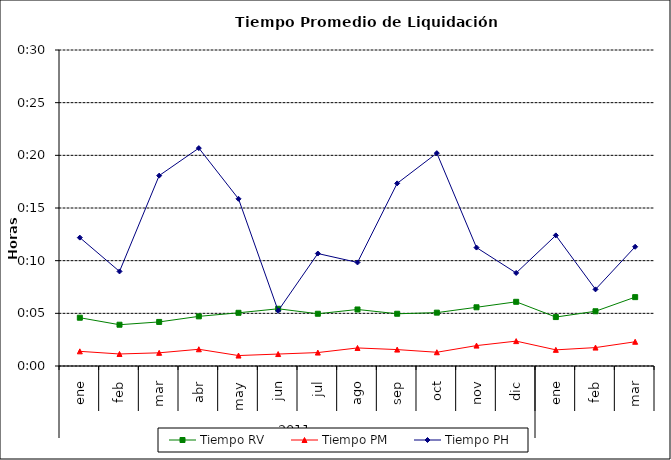
| Category | Tiempo RV | Tiempo PM | Tiempo PH |
|---|---|---|---|
| 0 | 0.003 | 0.001 | 0.009 |
| 1 | 0.003 | 0.001 | 0.006 |
| 2 | 0.003 | 0.001 | 0.013 |
| 3 | 0.003 | 0.001 | 0.014 |
| 4 | 0.004 | 0.001 | 0.011 |
| 5 | 0.004 | 0.001 | 0.004 |
| 6 | 0.003 | 0.001 | 0.007 |
| 7 | 0.004 | 0.001 | 0.007 |
| 8 | 0.003 | 0.001 | 0.012 |
| 9 | 0.004 | 0.001 | 0.014 |
| 10 | 0.004 | 0.001 | 0.008 |
| 11 | 0.004 | 0.002 | 0.006 |
| 12 | 0.003 | 0.001 | 0.009 |
| 13 | 0.004 | 0.001 | 0.005 |
| 14 | 0.005 | 0.002 | 0.008 |